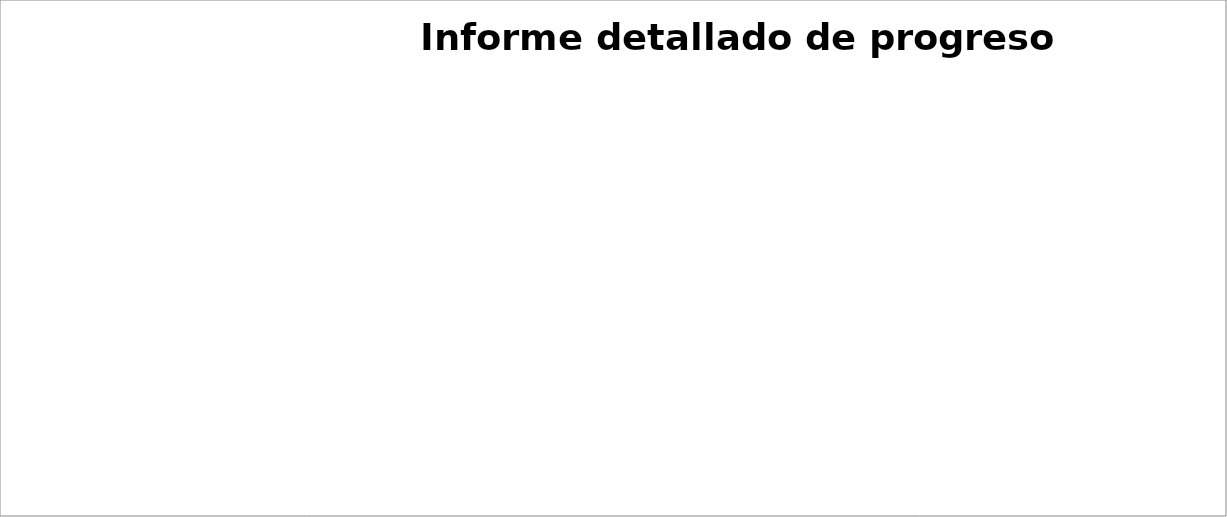
| Category | Series 1 | Series 0 |
|---|---|---|
| 4.1. Imparcialidad e Independencia | 0 | 0 |
| 4.2. Confidencialidad | 0 | 1 |
| 5.1. Requisitos administrativos | 0 | 0 |
| 5.2. Organización y gestión | 0 | 0 |
| 6.1. Personal | 0 | 0 |
| 6.2. Instalaciones y equipos | 0 | 1 |
| 6.3. Subcontratación | 0 | 0 |
| 7.1. Métodos y procedimientos de inspección | 0 | 0 |
| 7.2. Manejo de muestras y objetos presentados en la inspección | 0 | 0 |
| 7.3. Registros | 0 | 0 |
| 7.4. Informes y certificados de inspección | 0 | 0 |
| 7.5. Quejas y Apelaciones y 7.6 Proceso de Quejas y Apelaciones | 0 | 0 |
| 8.2. Documentación del sistema de gestión | 0 | 1 |
| 8.3. Control de documentos | 0 | 1 |
| 8.4. Control de grabaciones | 0 | 1 |
| 8.5. Revisión de la gestión | 0 | 1 |
| 8.6. Auditoría interna | 0 | 1 |
| 8.7. Acciones correctivas / 8.8 Acciones preventivas | 0 | 1 |